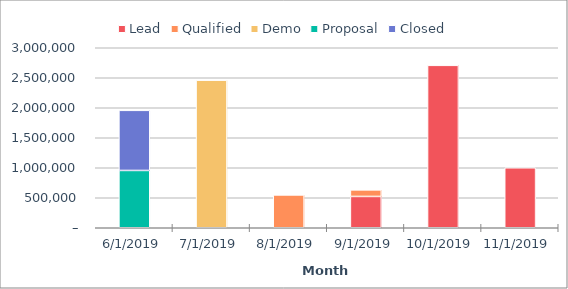
| Category | Lead | Qualified | Demo | Proposal | Closed |
|---|---|---|---|---|---|
| 11/30/19 | 1000000 | 0 | 0 | 0 | 0 |
| 10/31/19 | 2707000 | 0 | 0 | 0 | 0 |
| 9/30/19 | 522000 | 109000 | 0 | 0 | 0 |
| 8/31/19 | 0 | 547000 | 0 | 0 | 0 |
| 7/31/19 | 0 | 0 | 2460000 | 0 | 0 |
| 6/30/19 | 0 | 0 | 0 | 955000 | 1002000 |